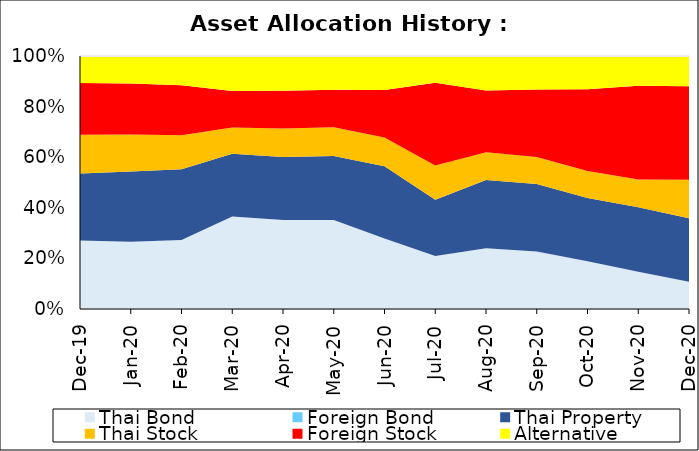
| Category | Thai Bond | Foreign Bond | Thai Property | Thai Stock | Foreign Stock | Alternative |
|---|---|---|---|---|---|---|
| 2019-12-30 | 0.271 | 0 | 0.265 | 0.153 | 0.204 | 0.106 |
| 2020-01-31 | 0.266 | 0 | 0.278 | 0.146 | 0.201 | 0.109 |
| 2020-02-28 | 0.273 | 0 | 0.279 | 0.134 | 0.198 | 0.116 |
| 2020-03-31 | 0.366 | 0 | 0.249 | 0.103 | 0.144 | 0.138 |
| 2020-04-30 | 0.352 | 0 | 0.249 | 0.112 | 0.149 | 0.137 |
| 2020-05-29 | 0.352 | 0 | 0.252 | 0.114 | 0.148 | 0.134 |
| 2020-06-30 | 0.278 | 0 | 0.286 | 0.113 | 0.188 | 0.134 |
| 2020-07-31 | 0.237 | 0 | 0.251 | 0.152 | 0.37 | 0.119 |
| 2020-08-31 | 0.24 | 0 | 0.27 | 0.11 | 0.244 | 0.136 |
| 2020-09-30 | 0.227 | 0 | 0.267 | 0.106 | 0.267 | 0.133 |
| 2020-10-30 | 0.188 | 0 | 0.251 | 0.106 | 0.324 | 0.131 |
| 2020-11-30 | 0.147 | 0 | 0.255 | 0.11 | 0.37 | 0.118 |
| 2020-12-30 | 0.108 | 0 | 0.251 | 0.152 | 0.37 | 0.119 |